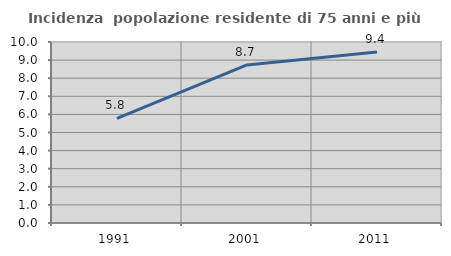
| Category | Incidenza  popolazione residente di 75 anni e più |
|---|---|
| 1991.0 | 5.777 |
| 2001.0 | 8.73 |
| 2011.0 | 9.449 |